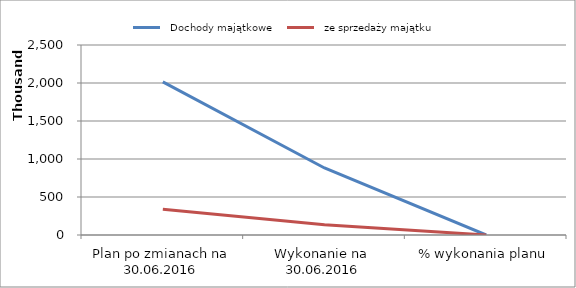
| Category |   Dochody majątkowe |   ze sprzedaży majątku |
|---|---|---|
| Plan po zmianach na 30.06.2016 | 2015317 | 338912 |
| Wykonanie na  30.06.2016 | 881738.14 | 133498.77 |
| % wykonania planu | 0.438 | 0.394 |